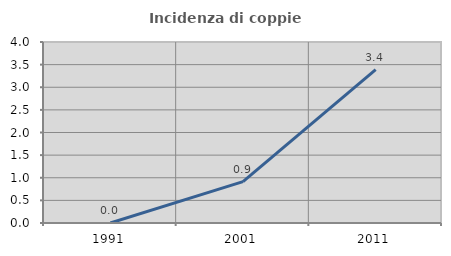
| Category | Incidenza di coppie miste |
|---|---|
| 1991.0 | 0 |
| 2001.0 | 0.913 |
| 2011.0 | 3.39 |